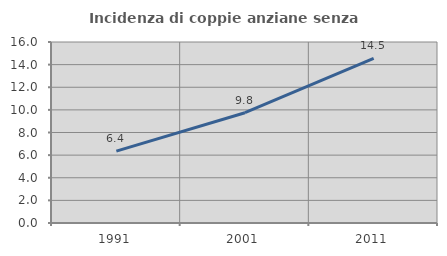
| Category | Incidenza di coppie anziane senza figli  |
|---|---|
| 1991.0 | 6.353 |
| 2001.0 | 9.751 |
| 2011.0 | 14.543 |